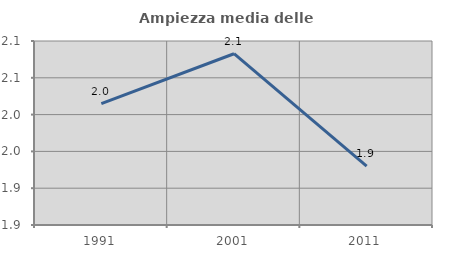
| Category | Ampiezza media delle famiglie |
|---|---|
| 1991.0 | 2.015 |
| 2001.0 | 2.083 |
| 2011.0 | 1.93 |